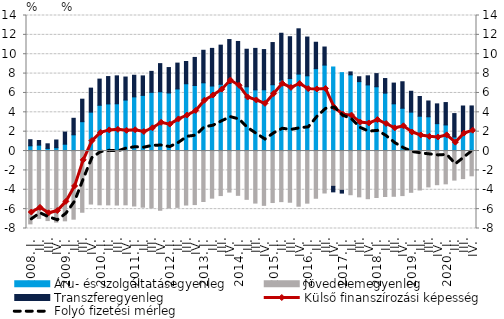
| Category | Áru- és szolgáltatásegyenleg | Jövedelemegyenleg | Transzferegyenleg |
|---|---|---|---|
| 2008. I. | 0.542 | -7.522 | 0.63 |
|          II. | 0.61 | -6.953 | 0.477 |
|          III. | 0.274 | -7.18 | 0.474 |
|          IV. | 0.347 | -7.339 | 0.794 |
| 2009. I. | 0.707 | -7.208 | 1.254 |
|          II. | 1.678 | -7.037 | 1.705 |
|          III. | 3.033 | -6.321 | 2.323 |
|          IV. | 4.018 | -5.474 | 2.481 |
| 2010. I. | 4.729 | -5.554 | 2.702 |
|          II. | 4.866 | -5.56 | 2.828 |
|          III. | 4.881 | -5.577 | 2.885 |
|          IV. | 5.27 | -5.556 | 2.375 |
| 2011. I. | 5.594 | -5.676 | 2.234 |
|          II. | 5.748 | -5.797 | 2.014 |
|          III. | 6.061 | -5.88 | 2.169 |
|          IV. | 6.121 | -6.116 | 2.908 |
| 2012. I. | 5.999 | -5.893 | 2.625 |
|          II. | 6.415 | -5.818 | 2.668 |
|          III. | 6.95 | -5.577 | 2.297 |
|          IV. | 6.767 | -5.529 | 2.903 |
| 2013. I. | 7.049 | -5.213 | 3.36 |
| II. | 6.717 | -4.866 | 3.887 |
|          III. | 6.896 | -4.599 | 4.042 |
| IV. | 6.986 | -4.238 | 4.531 |
| 2014. I. | 7.05 | -4.575 | 4.268 |
| II. | 6.636 | -4.987 | 3.879 |
|          III. | 6.32 | -5.375 | 4.284 |
| IV. | 6.328 | -5.609 | 4.153 |
| 2015. I. | 6.85 | -5.318 | 4.357 |
| II. | 7.318 | -5.223 | 4.849 |
|          III. | 7.485 | -5.289 | 4.324 |
| IV. | 7.95 | -5.698 | 4.676 |
| 2016. I. | 7.771 | -5.382 | 4.006 |
| II. | 8.512 | -4.875 | 2.726 |
|          III. | 8.877 | -4.333 | 1.868 |
| IV. | 8.682 | -3.645 | -0.57 |
| 2017. I. | 8.098 | -4.058 | -0.284 |
| II. | 7.87 | -4.512 | 0.304 |
|          III. | 7.17 | -4.73 | 0.503 |
| IV. | 6.827 | -4.922 | 0.942 |
| 2018. I. | 6.639 | -4.799 | 1.359 |
| II. | 5.982 | -4.697 | 1.508 |
|          III. | 4.878 | -4.673 | 2.141 |
| IV. | 4.42 | -4.601 | 2.736 |
| 2019. I. | 4.019 | -4.262 | 2.157 |
| II. | 3.596 | -4.022 | 2.039 |
|          III. | 3.54 | -3.705 | 1.63 |
| IV. | 2.828 | -3.475 | 2.045 |
| 2020. I. | 2.696 | -3.387 | 2.312 |
| II. | 1.449 | -3.002 | 2.419 |
|          III. | 1.748 | -2.847 | 2.904 |
| IV. | 2.29 | -2.557 | 2.369 |